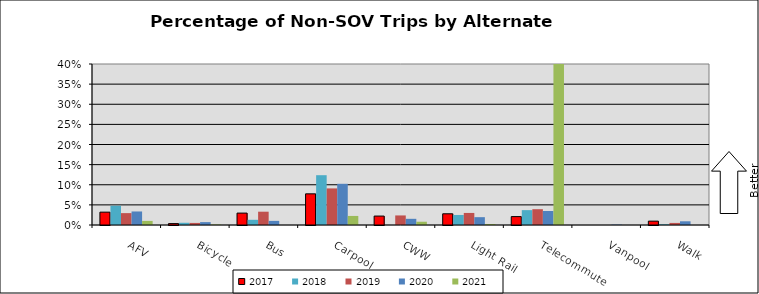
| Category | 2017 | 2018 | 2019 | 2020 | 2021 |
|---|---|---|---|---|---|
| AFV | 0.032 | 0.048 | 0.03 | 0.034 | 0.01 |
| Bicycle | 0.003 | 0.006 | 0.005 | 0.007 | 0.001 |
| Bus | 0.03 | 0.013 | 0.033 | 0.01 | 0 |
| Carpool | 0.077 | 0.124 | 0.091 | 0.102 | 0.023 |
| CWW | 0.022 | 0 | 0.024 | 0.015 | 0.008 |
| Light Rail | 0.028 | 0.025 | 0.03 | 0.019 | 0.003 |
| Telecommute | 0.021 | 0.037 | 0.039 | 0.035 | 0.803 |
| Vanpool | 0 | 0 | 0 | 0.001 | 0 |
| Walk | 0.01 | 0.002 | 0.005 | 0.009 | 0 |